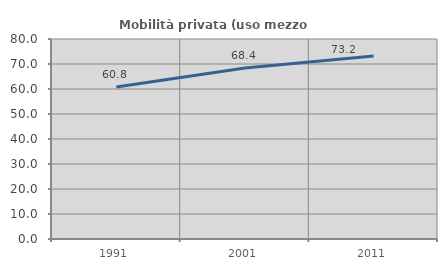
| Category | Mobilità privata (uso mezzo privato) |
|---|---|
| 1991.0 | 60.837 |
| 2001.0 | 68.395 |
| 2011.0 | 73.16 |